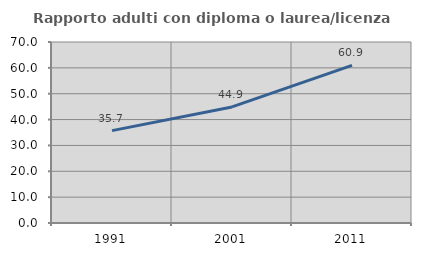
| Category | Rapporto adulti con diploma o laurea/licenza media  |
|---|---|
| 1991.0 | 35.714 |
| 2001.0 | 44.898 |
| 2011.0 | 60.938 |